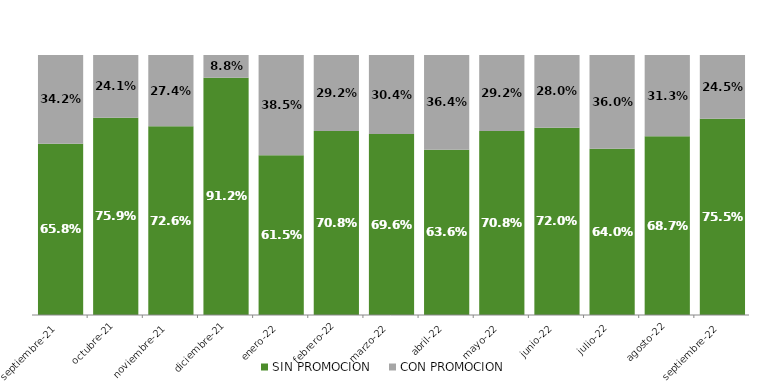
| Category | SIN PROMOCION   | CON PROMOCION   |
|---|---|---|
| 2021-09-01 | 0.658 | 0.342 |
| 2021-10-01 | 0.759 | 0.241 |
| 2021-11-01 | 0.726 | 0.274 |
| 2021-12-01 | 0.912 | 0.088 |
| 2022-01-01 | 0.615 | 0.385 |
| 2022-02-01 | 0.708 | 0.292 |
| 2022-03-01 | 0.696 | 0.304 |
| 2022-04-01 | 0.636 | 0.364 |
| 2022-05-01 | 0.708 | 0.292 |
| 2022-06-01 | 0.72 | 0.28 |
| 2022-07-01 | 0.64 | 0.36 |
| 2022-08-01 | 0.687 | 0.313 |
| 2022-09-01 | 0.755 | 0.245 |